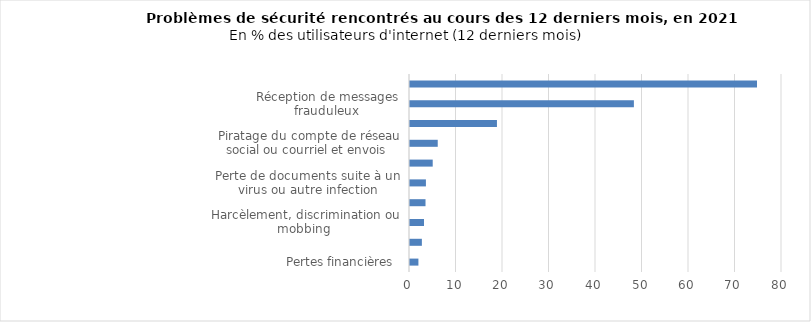
| Category | 2021 |
|---|---|
| Pertes financières  | 1.81 |
| Usurpation d'identité | 2.554 |
| Harcèlement, discrimination ou mobbing  | 3.006 |
| Accès par des enfants à des sites non recommandés | 3.336 |
| Perte de documents suite à un virus ou autre infection | 3.423 |
| Utilisation frauduleuse de votre carte de crédit ou de débit | 4.884 |
| Piratage du compte de réseau social ou courriel et envois  | 5.965 |
| Redirection vers de faux sites internet demandant des informations personnelles | 18.699 |
| Réception de messages frauduleux  | 48.148 |
| Spam | 74.624 |